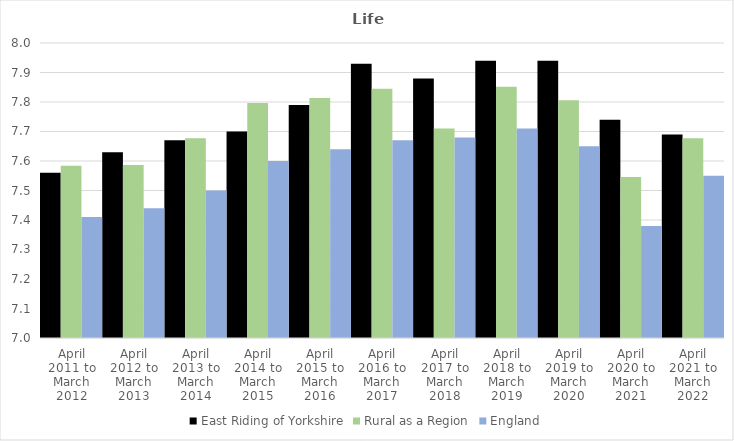
| Category | East Riding of Yorkshire | Rural as a Region | England |
|---|---|---|---|
| April 2011 to March 2012 | 7.56 | 7.584 | 7.41 |
| April 2012 to March 2013 | 7.63 | 7.586 | 7.44 |
| April 2013 to March 2014 | 7.67 | 7.677 | 7.5 |
| April 2014 to March 2015 | 7.7 | 7.797 | 7.6 |
| April 2015 to March 2016 | 7.79 | 7.813 | 7.64 |
| April 2016 to March 2017 | 7.93 | 7.845 | 7.67 |
| April 2017 to March 2018 | 7.88 | 7.71 | 7.68 |
| April 2018 to March 2019 | 7.94 | 7.852 | 7.71 |
| April 2019 to March 2020 | 7.94 | 7.806 | 7.65 |
| April 2020 to March 2021 | 7.74 | 7.546 | 7.38 |
| April 2021 to March 2022 | 7.69 | 7.677 | 7.55 |